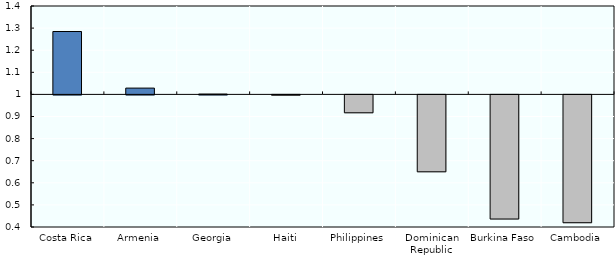
| Category | Series 0 |
|---|---|
| Costa Rica | 1.285 |
| Armenia | 1.029 |
| Georgia | 1.002 |
| Haiti | 0.999 |
| Philippines | 0.919 |
| Dominican Republic | 0.652 |
| Burkina Faso | 0.438 |
| Cambodia | 0.422 |